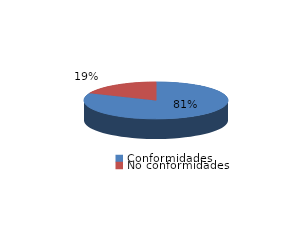
| Category | Series 0 |
|---|---|
| Conformidades | 3907 |
| No conformidades | 896 |